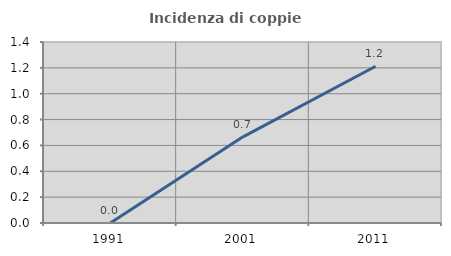
| Category | Incidenza di coppie miste |
|---|---|
| 1991.0 | 0 |
| 2001.0 | 0.667 |
| 2011.0 | 1.212 |